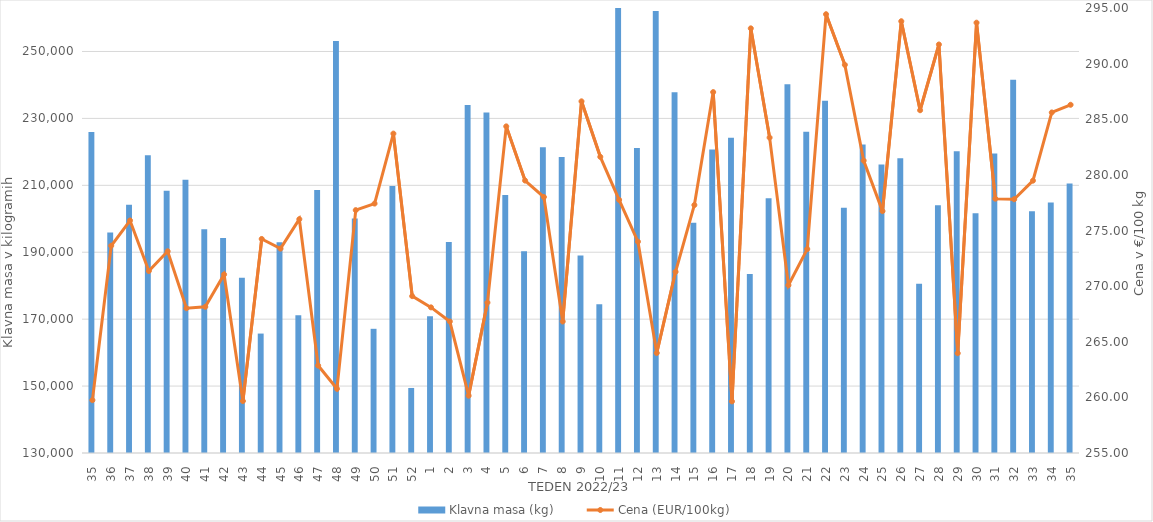
| Category | Klavna masa (kg) |
|---|---|
| 35.0 | 225927 |
| 36.0 | 195924 |
| 37.0 | 204224 |
| 38.0 | 218966 |
| 39.0 | 208403 |
| 40.0 | 211635 |
| 41.0 | 196841 |
| 42.0 | 194271 |
| 43.0 | 182399 |
| 44.0 | 165696 |
| 45.0 | 193022 |
| 46.0 | 171172 |
| 47.0 | 208597 |
| 48.0 | 253151 |
| 49.0 | 200117 |
| 50.0 | 167119 |
| 51.0 | 209797 |
| 52.0 | 149439 |
| 1.0 | 170843 |
| 2.0 | 193093 |
| 3.0 | 234042 |
| 4.0 | 231737 |
| 5.0 | 207136 |
| 6.0 | 190311 |
| 7.0 | 221366 |
| 8.0 | 218470 |
| 9.0 | 189006 |
| 10.0 | 174425 |
| 11.0 | 265476 |
| 12.0 | 221171 |
| 13.0 | 262102 |
| 14.0 | 237813 |
| 15.0 | 198828 |
| 16.0 | 220686 |
| 17.0 | 224192 |
| 18.0 | 183508 |
| 19.0 | 206133 |
| 20.0 | 240223 |
| 21.0 | 226050 |
| 22.0 | 235273 |
| 23.0 | 203306 |
| 24.0 | 222178 |
| 25.0 | 216259 |
| 26.0 | 218064 |
| 27.0 | 180556 |
| 28.0 | 204078 |
| 29.0 | 220162 |
| 30.0 | 201649 |
| 31.0 | 219538 |
| 32.0 | 241549 |
| 33.0 | 202261 |
| 34.0 | 204903 |
| 35.0 | 210575 |